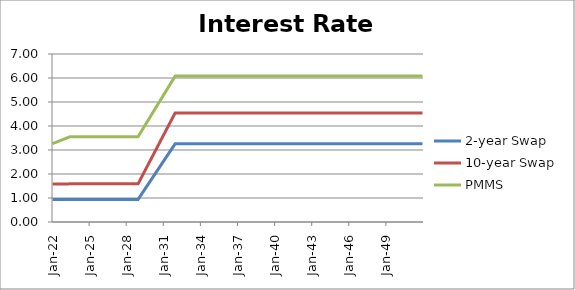
| Category | 2-year Swap | 10-year Swap | PMMS |
|---|---|---|---|
| 2022-01-31 | 0.941 | 1.581 | 3.265 |
| 2022-02-28 | 0.941 | 1.582 | 3.282 |
| 2022-03-31 | 0.941 | 1.582 | 3.299 |
| 2022-04-30 | 0.941 | 1.583 | 3.316 |
| 2022-05-31 | 0.941 | 1.583 | 3.333 |
| 2022-06-30 | 0.941 | 1.584 | 3.35 |
| 2022-07-31 | 0.941 | 1.584 | 3.367 |
| 2022-08-31 | 0.941 | 1.585 | 3.384 |
| 2022-09-30 | 0.941 | 1.585 | 3.4 |
| 2022-10-31 | 0.941 | 1.585 | 3.417 |
| 2022-11-30 | 0.941 | 1.586 | 3.434 |
| 2022-12-31 | 0.941 | 1.586 | 3.451 |
| 2023-01-31 | 0.941 | 1.587 | 3.468 |
| 2023-02-28 | 0.941 | 1.587 | 3.485 |
| 2023-03-31 | 0.941 | 1.588 | 3.502 |
| 2023-04-30 | 0.941 | 1.588 | 3.519 |
| 2023-05-31 | 0.941 | 1.589 | 3.536 |
| 2023-06-30 | 0.941 | 1.589 | 3.553 |
| 2023-07-31 | 0.941 | 1.589 | 3.553 |
| 2023-08-31 | 0.941 | 1.589 | 3.553 |
| 2023-09-30 | 0.941 | 1.589 | 3.553 |
| 2023-10-31 | 0.941 | 1.589 | 3.553 |
| 2023-11-30 | 0.941 | 1.589 | 3.553 |
| 2023-12-31 | 0.941 | 1.589 | 3.553 |
| 2024-01-31 | 0.941 | 1.589 | 3.553 |
| 2024-02-29 | 0.941 | 1.589 | 3.553 |
| 2024-03-31 | 0.941 | 1.589 | 3.553 |
| 2024-04-30 | 0.941 | 1.589 | 3.553 |
| 2024-05-31 | 0.941 | 1.589 | 3.553 |
| 2024-06-30 | 0.941 | 1.589 | 3.553 |
| 2024-07-31 | 0.941 | 1.589 | 3.553 |
| 2024-08-31 | 0.941 | 1.589 | 3.553 |
| 2024-09-30 | 0.941 | 1.589 | 3.553 |
| 2024-10-31 | 0.941 | 1.589 | 3.553 |
| 2024-11-30 | 0.941 | 1.589 | 3.553 |
| 2024-12-31 | 0.941 | 1.589 | 3.553 |
| 2025-01-31 | 0.941 | 1.589 | 3.553 |
| 2025-02-28 | 0.941 | 1.589 | 3.553 |
| 2025-03-31 | 0.941 | 1.589 | 3.553 |
| 2025-04-30 | 0.941 | 1.589 | 3.553 |
| 2025-05-31 | 0.941 | 1.589 | 3.553 |
| 2025-06-30 | 0.941 | 1.589 | 3.553 |
| 2025-07-31 | 0.941 | 1.589 | 3.553 |
| 2025-08-31 | 0.941 | 1.589 | 3.553 |
| 2025-09-30 | 0.941 | 1.589 | 3.553 |
| 2025-10-31 | 0.941 | 1.589 | 3.553 |
| 2025-11-30 | 0.941 | 1.589 | 3.553 |
| 2025-12-31 | 0.941 | 1.589 | 3.553 |
| 2026-01-31 | 0.941 | 1.589 | 3.553 |
| 2026-02-28 | 0.941 | 1.589 | 3.553 |
| 2026-03-31 | 0.941 | 1.589 | 3.553 |
| 2026-04-30 | 0.941 | 1.589 | 3.553 |
| 2026-05-31 | 0.941 | 1.589 | 3.553 |
| 2026-06-30 | 0.941 | 1.589 | 3.553 |
| 2026-07-31 | 0.941 | 1.589 | 3.553 |
| 2026-08-31 | 0.941 | 1.589 | 3.553 |
| 2026-09-30 | 0.941 | 1.589 | 3.553 |
| 2026-10-31 | 0.941 | 1.589 | 3.553 |
| 2026-11-30 | 0.941 | 1.589 | 3.553 |
| 2026-12-31 | 0.941 | 1.589 | 3.553 |
| 2027-01-31 | 0.941 | 1.589 | 3.553 |
| 2027-02-28 | 0.941 | 1.589 | 3.553 |
| 2027-03-31 | 0.941 | 1.589 | 3.553 |
| 2027-04-30 | 0.941 | 1.589 | 3.553 |
| 2027-05-31 | 0.941 | 1.589 | 3.553 |
| 2027-06-30 | 0.941 | 1.589 | 3.553 |
| 2027-07-31 | 0.941 | 1.589 | 3.553 |
| 2027-08-31 | 0.941 | 1.589 | 3.553 |
| 2027-09-30 | 0.941 | 1.589 | 3.553 |
| 2027-10-31 | 0.941 | 1.589 | 3.553 |
| 2027-11-30 | 0.941 | 1.589 | 3.553 |
| 2027-12-31 | 0.941 | 1.589 | 3.553 |
| 2028-01-31 | 0.941 | 1.589 | 3.553 |
| 2028-02-29 | 0.941 | 1.589 | 3.553 |
| 2028-03-31 | 0.941 | 1.589 | 3.553 |
| 2028-04-30 | 0.941 | 1.589 | 3.553 |
| 2028-05-31 | 0.941 | 1.589 | 3.553 |
| 2028-06-30 | 0.941 | 1.589 | 3.553 |
| 2028-07-31 | 0.941 | 1.589 | 3.553 |
| 2028-08-31 | 0.941 | 1.589 | 3.553 |
| 2028-09-30 | 0.941 | 1.589 | 3.553 |
| 2028-10-31 | 0.941 | 1.589 | 3.553 |
| 2028-11-30 | 0.941 | 1.589 | 3.553 |
| 2028-12-31 | 0.941 | 1.589 | 3.553 |
| 2029-01-31 | 1.005 | 1.671 | 3.623 |
| 2029-02-28 | 1.07 | 1.753 | 3.693 |
| 2029-03-31 | 1.134 | 1.835 | 3.763 |
| 2029-04-30 | 1.199 | 1.918 | 3.834 |
| 2029-05-31 | 1.263 | 2 | 3.904 |
| 2029-06-30 | 1.327 | 2.082 | 3.974 |
| 2029-07-31 | 1.392 | 2.164 | 4.044 |
| 2029-08-31 | 1.456 | 2.246 | 4.114 |
| 2029-09-30 | 1.521 | 2.328 | 4.185 |
| 2029-10-31 | 1.585 | 2.41 | 4.255 |
| 2029-11-30 | 1.649 | 2.493 | 4.325 |
| 2029-12-31 | 1.714 | 2.575 | 4.395 |
| 2030-01-31 | 1.778 | 2.657 | 4.465 |
| 2030-02-28 | 1.843 | 2.739 | 4.535 |
| 2030-03-31 | 1.907 | 2.821 | 4.606 |
| 2030-04-30 | 1.971 | 2.903 | 4.676 |
| 2030-05-31 | 2.036 | 2.985 | 4.746 |
| 2030-06-30 | 2.1 | 3.067 | 4.816 |
| 2030-07-31 | 2.165 | 3.15 | 4.886 |
| 2030-08-31 | 2.229 | 3.232 | 4.956 |
| 2030-09-30 | 2.293 | 3.314 | 5.027 |
| 2030-10-31 | 2.358 | 3.396 | 5.097 |
| 2030-11-30 | 2.422 | 3.478 | 5.167 |
| 2030-12-31 | 2.487 | 3.56 | 5.237 |
| 2031-01-31 | 2.551 | 3.642 | 5.307 |
| 2031-02-28 | 2.615 | 3.725 | 5.377 |
| 2031-03-31 | 2.68 | 3.807 | 5.448 |
| 2031-04-30 | 2.744 | 3.889 | 5.518 |
| 2031-05-31 | 2.809 | 3.971 | 5.588 |
| 2031-06-30 | 2.873 | 4.053 | 5.658 |
| 2031-07-31 | 2.937 | 4.135 | 5.728 |
| 2031-08-31 | 3.002 | 4.217 | 5.798 |
| 2031-09-30 | 3.066 | 4.3 | 5.869 |
| 2031-10-31 | 3.131 | 4.382 | 5.939 |
| 2031-11-30 | 3.195 | 4.464 | 6.009 |
| 2031-12-31 | 3.259 | 4.546 | 6.079 |
| 2032-01-31 | 3.259 | 4.546 | 6.079 |
| 2032-02-29 | 3.259 | 4.546 | 6.079 |
| 2032-03-31 | 3.259 | 4.546 | 6.079 |
| 2032-04-30 | 3.259 | 4.546 | 6.079 |
| 2032-05-31 | 3.259 | 4.546 | 6.079 |
| 2032-06-30 | 3.259 | 4.546 | 6.079 |
| 2032-07-31 | 3.259 | 4.546 | 6.079 |
| 2032-08-31 | 3.259 | 4.546 | 6.079 |
| 2032-09-30 | 3.259 | 4.546 | 6.079 |
| 2032-10-31 | 3.259 | 4.546 | 6.079 |
| 2032-11-30 | 3.259 | 4.546 | 6.079 |
| 2032-12-31 | 3.259 | 4.546 | 6.079 |
| 2033-01-31 | 3.259 | 4.546 | 6.079 |
| 2033-02-28 | 3.259 | 4.546 | 6.079 |
| 2033-03-31 | 3.259 | 4.546 | 6.079 |
| 2033-04-30 | 3.259 | 4.546 | 6.079 |
| 2033-05-31 | 3.259 | 4.546 | 6.079 |
| 2033-06-30 | 3.259 | 4.546 | 6.079 |
| 2033-07-31 | 3.259 | 4.546 | 6.079 |
| 2033-08-31 | 3.259 | 4.546 | 6.079 |
| 2033-09-30 | 3.259 | 4.546 | 6.079 |
| 2033-10-31 | 3.259 | 4.546 | 6.079 |
| 2033-11-30 | 3.259 | 4.546 | 6.079 |
| 2033-12-31 | 3.259 | 4.546 | 6.079 |
| 2034-01-31 | 3.259 | 4.546 | 6.079 |
| 2034-02-28 | 3.259 | 4.546 | 6.079 |
| 2034-03-31 | 3.259 | 4.546 | 6.079 |
| 2034-04-30 | 3.259 | 4.546 | 6.079 |
| 2034-05-31 | 3.259 | 4.546 | 6.079 |
| 2034-06-30 | 3.259 | 4.546 | 6.079 |
| 2034-07-31 | 3.259 | 4.546 | 6.079 |
| 2034-08-31 | 3.259 | 4.546 | 6.079 |
| 2034-09-30 | 3.259 | 4.546 | 6.079 |
| 2034-10-31 | 3.259 | 4.546 | 6.079 |
| 2034-11-30 | 3.259 | 4.546 | 6.079 |
| 2034-12-31 | 3.259 | 4.546 | 6.079 |
| 2035-01-31 | 3.259 | 4.546 | 6.079 |
| 2035-02-28 | 3.259 | 4.546 | 6.079 |
| 2035-03-31 | 3.259 | 4.546 | 6.079 |
| 2035-04-30 | 3.259 | 4.546 | 6.079 |
| 2035-05-31 | 3.259 | 4.546 | 6.079 |
| 2035-06-30 | 3.259 | 4.546 | 6.079 |
| 2035-07-31 | 3.259 | 4.546 | 6.079 |
| 2035-08-31 | 3.259 | 4.546 | 6.079 |
| 2035-09-30 | 3.259 | 4.546 | 6.079 |
| 2035-10-31 | 3.259 | 4.546 | 6.079 |
| 2035-11-30 | 3.259 | 4.546 | 6.079 |
| 2035-12-31 | 3.259 | 4.546 | 6.079 |
| 2036-01-31 | 3.259 | 4.546 | 6.079 |
| 2036-02-29 | 3.259 | 4.546 | 6.079 |
| 2036-03-31 | 3.259 | 4.546 | 6.079 |
| 2036-04-30 | 3.259 | 4.546 | 6.079 |
| 2036-05-31 | 3.259 | 4.546 | 6.079 |
| 2036-06-30 | 3.259 | 4.546 | 6.079 |
| 2036-07-31 | 3.259 | 4.546 | 6.079 |
| 2036-08-31 | 3.259 | 4.546 | 6.079 |
| 2036-09-30 | 3.259 | 4.546 | 6.079 |
| 2036-10-31 | 3.259 | 4.546 | 6.079 |
| 2036-11-30 | 3.259 | 4.546 | 6.079 |
| 2036-12-31 | 3.259 | 4.546 | 6.079 |
| 2037-01-31 | 3.259 | 4.546 | 6.079 |
| 2037-02-28 | 3.259 | 4.546 | 6.079 |
| 2037-03-31 | 3.259 | 4.546 | 6.079 |
| 2037-04-30 | 3.259 | 4.546 | 6.079 |
| 2037-05-31 | 3.259 | 4.546 | 6.079 |
| 2037-06-30 | 3.259 | 4.546 | 6.079 |
| 2037-07-31 | 3.259 | 4.546 | 6.079 |
| 2037-08-31 | 3.259 | 4.546 | 6.079 |
| 2037-09-30 | 3.259 | 4.546 | 6.079 |
| 2037-10-31 | 3.259 | 4.546 | 6.079 |
| 2037-11-30 | 3.259 | 4.546 | 6.079 |
| 2037-12-31 | 3.259 | 4.546 | 6.079 |
| 2038-01-31 | 3.259 | 4.546 | 6.079 |
| 2038-02-28 | 3.259 | 4.546 | 6.079 |
| 2038-03-31 | 3.259 | 4.546 | 6.079 |
| 2038-04-30 | 3.259 | 4.546 | 6.079 |
| 2038-05-31 | 3.259 | 4.546 | 6.079 |
| 2038-06-30 | 3.259 | 4.546 | 6.079 |
| 2038-07-31 | 3.259 | 4.546 | 6.079 |
| 2038-08-31 | 3.259 | 4.546 | 6.079 |
| 2038-09-30 | 3.259 | 4.546 | 6.079 |
| 2038-10-31 | 3.259 | 4.546 | 6.079 |
| 2038-11-30 | 3.259 | 4.546 | 6.079 |
| 2038-12-31 | 3.259 | 4.546 | 6.079 |
| 2039-01-31 | 3.259 | 4.546 | 6.079 |
| 2039-02-28 | 3.259 | 4.546 | 6.079 |
| 2039-03-31 | 3.259 | 4.546 | 6.079 |
| 2039-04-30 | 3.259 | 4.546 | 6.079 |
| 2039-05-31 | 3.259 | 4.546 | 6.079 |
| 2039-06-30 | 3.259 | 4.546 | 6.079 |
| 2039-07-31 | 3.259 | 4.546 | 6.079 |
| 2039-08-31 | 3.259 | 4.546 | 6.079 |
| 2039-09-30 | 3.259 | 4.546 | 6.079 |
| 2039-10-31 | 3.259 | 4.546 | 6.079 |
| 2039-11-30 | 3.259 | 4.546 | 6.079 |
| 2039-12-31 | 3.259 | 4.546 | 6.079 |
| 2040-01-31 | 3.259 | 4.546 | 6.079 |
| 2040-02-29 | 3.259 | 4.546 | 6.079 |
| 2040-03-31 | 3.259 | 4.546 | 6.079 |
| 2040-04-30 | 3.259 | 4.546 | 6.079 |
| 2040-05-31 | 3.259 | 4.546 | 6.079 |
| 2040-06-30 | 3.259 | 4.546 | 6.079 |
| 2040-07-31 | 3.259 | 4.546 | 6.079 |
| 2040-08-31 | 3.259 | 4.546 | 6.079 |
| 2040-09-30 | 3.259 | 4.546 | 6.079 |
| 2040-10-31 | 3.259 | 4.546 | 6.079 |
| 2040-11-30 | 3.259 | 4.546 | 6.079 |
| 2040-12-31 | 3.259 | 4.546 | 6.079 |
| 2041-01-31 | 3.259 | 4.546 | 6.079 |
| 2041-02-28 | 3.259 | 4.546 | 6.079 |
| 2041-03-31 | 3.259 | 4.546 | 6.079 |
| 2041-04-30 | 3.259 | 4.546 | 6.079 |
| 2041-05-31 | 3.259 | 4.546 | 6.079 |
| 2041-06-30 | 3.259 | 4.546 | 6.079 |
| 2041-07-31 | 3.259 | 4.546 | 6.079 |
| 2041-08-31 | 3.259 | 4.546 | 6.079 |
| 2041-09-30 | 3.259 | 4.546 | 6.079 |
| 2041-10-31 | 3.259 | 4.546 | 6.079 |
| 2041-11-30 | 3.259 | 4.546 | 6.079 |
| 2041-12-31 | 3.259 | 4.546 | 6.079 |
| 2042-01-31 | 3.259 | 4.546 | 6.079 |
| 2042-02-28 | 3.259 | 4.546 | 6.079 |
| 2042-03-31 | 3.259 | 4.546 | 6.079 |
| 2042-04-30 | 3.259 | 4.546 | 6.079 |
| 2042-05-31 | 3.259 | 4.546 | 6.079 |
| 2042-06-30 | 3.259 | 4.546 | 6.079 |
| 2042-07-31 | 3.259 | 4.546 | 6.079 |
| 2042-08-31 | 3.259 | 4.546 | 6.079 |
| 2042-09-30 | 3.259 | 4.546 | 6.079 |
| 2042-10-31 | 3.259 | 4.546 | 6.079 |
| 2042-11-30 | 3.259 | 4.546 | 6.079 |
| 2042-12-31 | 3.259 | 4.546 | 6.079 |
| 2043-01-31 | 3.259 | 4.546 | 6.079 |
| 2043-02-28 | 3.259 | 4.546 | 6.079 |
| 2043-03-31 | 3.259 | 4.546 | 6.079 |
| 2043-04-30 | 3.259 | 4.546 | 6.079 |
| 2043-05-31 | 3.259 | 4.546 | 6.079 |
| 2043-06-30 | 3.259 | 4.546 | 6.079 |
| 2043-07-31 | 3.259 | 4.546 | 6.079 |
| 2043-08-31 | 3.259 | 4.546 | 6.079 |
| 2043-09-30 | 3.259 | 4.546 | 6.079 |
| 2043-10-31 | 3.259 | 4.546 | 6.079 |
| 2043-11-30 | 3.259 | 4.546 | 6.079 |
| 2043-12-31 | 3.259 | 4.546 | 6.079 |
| 2044-01-31 | 3.259 | 4.546 | 6.079 |
| 2044-02-29 | 3.259 | 4.546 | 6.079 |
| 2044-03-31 | 3.259 | 4.546 | 6.079 |
| 2044-04-30 | 3.259 | 4.546 | 6.079 |
| 2044-05-31 | 3.259 | 4.546 | 6.079 |
| 2044-06-30 | 3.259 | 4.546 | 6.079 |
| 2044-07-31 | 3.259 | 4.546 | 6.079 |
| 2044-08-31 | 3.259 | 4.546 | 6.079 |
| 2044-09-30 | 3.259 | 4.546 | 6.079 |
| 2044-10-31 | 3.259 | 4.546 | 6.079 |
| 2044-11-30 | 3.259 | 4.546 | 6.079 |
| 2044-12-31 | 3.259 | 4.546 | 6.079 |
| 2045-01-31 | 3.259 | 4.546 | 6.079 |
| 2045-02-28 | 3.259 | 4.546 | 6.079 |
| 2045-03-31 | 3.259 | 4.546 | 6.079 |
| 2045-04-30 | 3.259 | 4.546 | 6.079 |
| 2045-05-31 | 3.259 | 4.546 | 6.079 |
| 2045-06-30 | 3.259 | 4.546 | 6.079 |
| 2045-07-31 | 3.259 | 4.546 | 6.079 |
| 2045-08-31 | 3.259 | 4.546 | 6.079 |
| 2045-09-30 | 3.259 | 4.546 | 6.079 |
| 2045-10-31 | 3.259 | 4.546 | 6.079 |
| 2045-11-30 | 3.259 | 4.546 | 6.079 |
| 2045-12-31 | 3.259 | 4.546 | 6.079 |
| 2046-01-31 | 3.259 | 4.546 | 6.079 |
| 2046-02-28 | 3.259 | 4.546 | 6.079 |
| 2046-03-31 | 3.259 | 4.546 | 6.079 |
| 2046-04-30 | 3.259 | 4.546 | 6.079 |
| 2046-05-31 | 3.259 | 4.546 | 6.079 |
| 2046-06-30 | 3.259 | 4.546 | 6.079 |
| 2046-07-31 | 3.259 | 4.546 | 6.079 |
| 2046-08-31 | 3.259 | 4.546 | 6.079 |
| 2046-09-30 | 3.259 | 4.546 | 6.079 |
| 2046-10-31 | 3.259 | 4.546 | 6.079 |
| 2046-11-30 | 3.259 | 4.546 | 6.079 |
| 2046-12-31 | 3.259 | 4.546 | 6.079 |
| 2047-01-31 | 3.259 | 4.546 | 6.079 |
| 2047-02-28 | 3.259 | 4.546 | 6.079 |
| 2047-03-31 | 3.259 | 4.546 | 6.079 |
| 2047-04-30 | 3.259 | 4.546 | 6.079 |
| 2047-05-31 | 3.259 | 4.546 | 6.079 |
| 2047-06-30 | 3.259 | 4.546 | 6.079 |
| 2047-07-31 | 3.259 | 4.546 | 6.079 |
| 2047-08-31 | 3.259 | 4.546 | 6.079 |
| 2047-09-30 | 3.259 | 4.546 | 6.079 |
| 2047-10-31 | 3.259 | 4.546 | 6.079 |
| 2047-11-30 | 3.259 | 4.546 | 6.079 |
| 2047-12-31 | 3.259 | 4.546 | 6.079 |
| 2048-01-31 | 3.259 | 4.546 | 6.079 |
| 2048-02-29 | 3.259 | 4.546 | 6.079 |
| 2048-03-31 | 3.259 | 4.546 | 6.079 |
| 2048-04-30 | 3.259 | 4.546 | 6.079 |
| 2048-05-31 | 3.259 | 4.546 | 6.079 |
| 2048-06-30 | 3.259 | 4.546 | 6.079 |
| 2048-07-31 | 3.259 | 4.546 | 6.079 |
| 2048-08-31 | 3.259 | 4.546 | 6.079 |
| 2048-09-30 | 3.259 | 4.546 | 6.079 |
| 2048-10-31 | 3.259 | 4.546 | 6.079 |
| 2048-11-30 | 3.259 | 4.546 | 6.079 |
| 2048-12-31 | 3.259 | 4.546 | 6.079 |
| 2049-01-31 | 3.259 | 4.546 | 6.079 |
| 2049-02-28 | 3.259 | 4.546 | 6.079 |
| 2049-03-31 | 3.259 | 4.546 | 6.079 |
| 2049-04-30 | 3.259 | 4.546 | 6.079 |
| 2049-05-31 | 3.259 | 4.546 | 6.079 |
| 2049-06-30 | 3.259 | 4.546 | 6.079 |
| 2049-07-31 | 3.259 | 4.546 | 6.079 |
| 2049-08-31 | 3.259 | 4.546 | 6.079 |
| 2049-09-30 | 3.259 | 4.546 | 6.079 |
| 2049-10-31 | 3.259 | 4.546 | 6.079 |
| 2049-11-30 | 3.259 | 4.546 | 6.079 |
| 2049-12-31 | 3.259 | 4.546 | 6.079 |
| 2050-01-31 | 3.259 | 4.546 | 6.079 |
| 2050-02-28 | 3.259 | 4.546 | 6.079 |
| 2050-03-31 | 3.259 | 4.546 | 6.079 |
| 2050-04-30 | 3.259 | 4.546 | 6.079 |
| 2050-05-31 | 3.259 | 4.546 | 6.079 |
| 2050-06-30 | 3.259 | 4.546 | 6.079 |
| 2050-07-31 | 3.259 | 4.546 | 6.079 |
| 2050-08-31 | 3.259 | 4.546 | 6.079 |
| 2050-09-30 | 3.259 | 4.546 | 6.079 |
| 2050-10-31 | 3.259 | 4.546 | 6.079 |
| 2050-11-30 | 3.259 | 4.546 | 6.079 |
| 2050-12-31 | 3.259 | 4.546 | 6.079 |
| 2051-01-31 | 3.259 | 4.546 | 6.079 |
| 2051-02-28 | 3.259 | 4.546 | 6.079 |
| 2051-03-31 | 3.259 | 4.546 | 6.079 |
| 2051-04-30 | 3.259 | 4.546 | 6.079 |
| 2051-05-31 | 3.259 | 4.546 | 6.079 |
| 2051-06-30 | 3.259 | 4.546 | 6.079 |
| 2051-07-31 | 3.259 | 4.546 | 6.079 |
| 2051-08-31 | 3.259 | 4.546 | 6.079 |
| 2051-09-30 | 3.259 | 4.546 | 6.079 |
| 2051-10-31 | 3.259 | 4.546 | 6.079 |
| 2051-11-30 | 3.259 | 4.546 | 6.079 |
| 2051-12-31 | 3.259 | 4.546 | 6.079 |